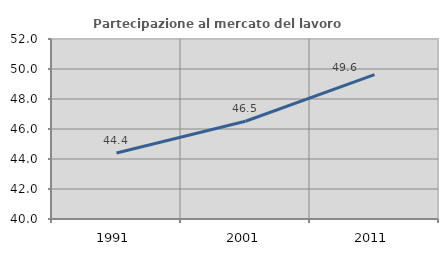
| Category | Partecipazione al mercato del lavoro  femminile |
|---|---|
| 1991.0 | 44.405 |
| 2001.0 | 46.515 |
| 2011.0 | 49.621 |